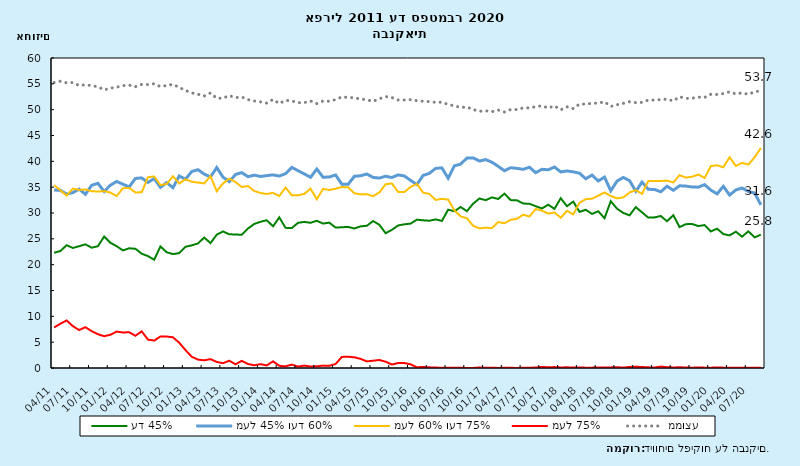
| Category | עד 45% | מעל 45% ועד 60% | מעל 60% ועד 75% | מעל 75%  | ממוצע |
|---|---|---|---|---|---|
| 2011-04-01 | 22.31 | 34.448 | 35.405 | 7.837 | 55.261 |
| 2011-05-01 | 22.647 | 34.385 | 34.396 | 8.572 | 55.509 |
| 2011-06-01 | 23.771 | 33.654 | 33.371 | 9.203 | 55.192 |
| 2011-07-01 | 23.235 | 33.946 | 34.726 | 8.092 | 55.252 |
| 2011-08-01 | 23.572 | 34.616 | 34.468 | 7.344 | 54.677 |
| 2011-09-01 | 23.937 | 33.622 | 34.542 | 7.899 | 54.814 |
| 2011-10-01 | 23.287 | 35.363 | 34.221 | 7.129 | 54.645 |
| 2011-11-01 | 23.569 | 35.745 | 34.145 | 6.541 | 54.432 |
| 2011-12-01 | 25.448 | 34.163 | 34.239 | 6.15 | 53.812 |
| 2012-01-01 | 24.229 | 35.382 | 33.955 | 6.435 | 54.163 |
| 2012-02-01 | 23.58 | 36.102 | 33.272 | 7.047 | 54.339 |
| 2012-03-01 | 22.758 | 35.565 | 34.799 | 6.878 | 54.667 |
| 2012-04-01 | 23.177 | 35.056 | 34.85 | 6.916 | 54.761 |
| 2012-05-01 | 23.079 | 36.692 | 33.984 | 6.245 | 54.438 |
| 2012-06-01 | 22.117 | 36.794 | 33.998 | 7.091 | 54.883 |
| 2012-07-01 | 21.663 | 35.916 | 36.922 | 5.499 | 54.85 |
| 2012-08-01 | 20.956 | 36.66 | 37.074 | 5.31 | 55.012 |
| 2012-09-01 | 23.53 | 34.964 | 35.402 | 6.105 | 54.457 |
| 2012-10-01 | 22.399 | 35.885 | 35.624 | 6.092 | 54.675 |
| 2012-11-01 | 22.052 | 34.889 | 37.116 | 5.943 | 54.901 |
| 2012-12-01 | 22.234 | 37.167 | 35.704 | 4.895 | 54.296 |
| 2013-01-01 | 23.457 | 36.54 | 36.534 | 3.47 | 53.73 |
| 2013-02-01 | 23.739 | 38.022 | 36.053 | 2.185 | 53.246 |
| 2013-03-01 | 24.106 | 38.382 | 35.888 | 1.624 | 52.987 |
| 2013-04-01 | 25.258 | 37.522 | 35.727 | 1.493 | 52.633 |
| 2013-05-01 | 24.172 | 36.972 | 37.14 | 1.715 | 53.237 |
| 2013-06-01 | 25.805 | 38.802 | 34.216 | 1.177 | 52.207 |
| 2013-07-01 | 26.432 | 36.933 | 35.711 | 0.924 | 52.22 |
| 2013-08-01 | 25.879 | 36.058 | 36.653 | 1.409 | 52.718 |
| 2013-09-01 | 25.844 | 37.451 | 35.986 | 0.719 | 52.334 |
| 2013-10-01 | 25.777 | 37.817 | 35.026 | 1.38 | 52.448 |
| 2013-11-01 | 26.999 | 37.022 | 35.212 | 0.767 | 51.943 |
| 2013-12-01 | 27.882 | 37.327 | 34.26 | 0.531 | 51.68 |
| 2014-01-01 | 28.304 | 37.07 | 33.882 | 0.744 | 51.508 |
| 2014-02-01 | 28.595 | 37.235 | 33.667 | 0.503 | 51.261 |
| 2014-03-01 | 27.42 | 37.383 | 33.911 | 1.286 | 51.976 |
| 2014-04-01 | 29.15 | 37.15 | 33.276 | 0.424 | 51.192 |
| 2014-05-01 | 27.127 | 37.617 | 34.938 | 0.317 | 51.805 |
| 2014-06-01 | 27.084 | 38.831 | 33.429 | 0.656 | 51.689 |
| 2014-07-01 | 28.104 | 38.19 | 33.434 | 0.272 | 51.349 |
| 2014-08-01 | 28.281 | 37.557 | 33.7 | 0.463 | 51.359 |
| 2014-09-01 | 28.102 | 36.91 | 34.698 | 0.291 | 51.679 |
| 2014-10-01 | 28.493 | 38.508 | 32.664 | 0.335 | 51.171 |
| 2014-11-01 | 27.956 | 36.921 | 34.662 | 0.461 | 51.684 |
| 2014-12-01 | 28.134 | 36.969 | 34.464 | 0.433 | 51.631 |
| 2015-01-01 | 27.175 | 37.359 | 34.691 | 0.774 | 51.944 |
| 2015-02-01 | 27.242 | 35.583 | 35.03 | 2.144 | 52.467 |
| 2015-03-01 | 27.305 | 35.539 | 34.973 | 2.183 | 52.367 |
| 2015-04-01 | 27.007 | 37.098 | 33.825 | 2.069 | 52.285 |
| 2015-05-01 | 27.413 | 37.208 | 33.608 | 1.77 | 52.074 |
| 2015-06-01 | 27.525 | 37.55 | 33.647 | 1.278 | 51.906 |
| 2015-07-01 | 28.443 | 36.887 | 33.258 | 1.413 | 51.619 |
| 2015-08-01 | 27.718 | 36.759 | 33.976 | 1.547 | 52.101 |
| 2015-09-01 | 26.093 | 37.12 | 35.564 | 1.224 | 52.54 |
| 2015-10-01 | 26.733 | 36.863 | 35.731 | 0.673 | 52.34 |
| 2015-11-01 | 27.588 | 37.375 | 34.078 | 0.959 | 51.87 |
| 2015-12-01 | 27.811 | 37.162 | 34.061 | 0.967 | 51.874 |
| 2016-01-01 | 27.947 | 36.305 | 35.038 | 0.709 | 51.941 |
| 2016-02-01 | 28.711 | 35.515 | 35.635 | 0.139 | 51.733 |
| 2016-03-01 | 28.584 | 37.276 | 33.939 | 0.202 | 51.629 |
| 2016-04-01 | 28.508 | 37.681 | 33.684 | 0.127 | 51.558 |
| 2016-05-01 | 28.762 | 38.631 | 32.529 | 0.078 | 51.422 |
| 2016-06-01 | 28.471 | 38.732 | 32.737 | 0.061 | 51.446 |
| 2016-07-01 | 30.636 | 36.731 | 32.594 | 0.039 | 51.008 |
| 2016-08-01 | 30.341 | 39.126 | 30.5 | 0.034 | 50.733 |
| 2016-09-01 | 31.155 | 39.463 | 29.333 | 0.049 | 50.426 |
| 2016-10-01 | 30.356 | 40.637 | 28.996 | 0.011 | 50.527 |
| 2016-11-01 | 31.808 | 40.666 | 27.512 | 0.013 | 50.009 |
| 2016-12-01 | 32.809 | 40.051 | 27.036 | 0.104 | 49.689 |
| 2017-01-01 | 32.48 | 40.335 | 27.149 | 0.036 | 49.774 |
| 2017-02-01 | 33.026 | 39.833 | 27.076 | 0.065 | 49.615 |
| 2017-03-01 | 32.715 | 39.027 | 28.253 | 0.006 | 49.931 |
| 2017-04-01 | 33.745 | 38.184 | 28.005 | 0.066 | 49.549 |
| 2017-05-01 | 32.495 | 38.771 | 28.695 | 0.039 | 50.032 |
| 2017-06-01 | 32.461 | 38.637 | 28.889 | 0.013 | 50.022 |
| 2017-07-01 | 31.839 | 38.448 | 29.666 | 0.046 | 50.344 |
| 2017-08-01 | 31.775 | 38.856 | 29.325 | 0.045 | 50.341 |
| 2017-09-01 | 31.318 | 37.81 | 30.776 | 0.096 | 50.569 |
| 2017-10-01 | 30.877 | 38.46 | 30.469 | 0.193 | 50.756 |
| 2017-11-01 | 31.605 | 38.363 | 29.884 | 0.148 | 50.309 |
| 2017-12-01 | 30.806 | 38.903 | 30.115 | 0.175 | 50.731 |
| 2018-01-01 | 32.862 | 37.954 | 29.076 | 0.107 | 49.97 |
| 2018-02-01 | 31.315 | 38.136 | 30.419 | 0.131 | 50.554 |
| 2018-03-01 | 32.205 | 37.962 | 29.74 | 0.092 | 50.204 |
| 2018-04-01 | 30.213 | 37.705 | 31.972 | 0.11 | 51.097 |
| 2018-05-01 | 30.625 | 36.631 | 32.679 | 0.065 | 51.058 |
| 2018-06-01 | 29.825 | 37.334 | 32.772 | 0.07 | 51.242 |
| 2018-07-01 | 30.342 | 36.196 | 33.365 | 0.096 | 51.252 |
| 2018-08-01 | 28.985 | 36.949 | 33.979 | 0.088 | 51.532 |
| 2018-09-01 | 32.29 | 34.296 | 33.296 | 0.118 | 50.624 |
| 2018-10-01 | 30.837 | 36.171 | 32.835 | 0.157 | 50.949 |
| 2018-11-01 | 30.021 | 36.881 | 33.024 | 0.074 | 51.215 |
| 2018-12-01 | 29.546 | 36.262 | 33.984 | 0.208 | 51.538 |
| 2019-01-01 | 31.14 | 34.208 | 34.408 | 0.245 | 51.354 |
| 2019-02-01 | 30.127 | 35.983 | 33.705 | 0.184 | 51.412 |
| 2019-03-01 | 29.104 | 34.588 | 36.182 | 0.126 | 51.856 |
| 2019-04-01 | 29.155 | 34.549 | 36.208 | 0.089 | 51.862 |
| 2019-05-01 | 29.416 | 34.111 | 36.193 | 0.28 | 51.951 |
| 2019-06-01 | 28.4 | 35.186 | 36.268 | 0.146 | 52.035 |
| 2019-07-01 | 29.583 | 34.394 | 35.911 | 0.112 | 51.689 |
| 2019-08-01 | 27.274 | 35.267 | 37.328 | 0.13 | 52.5 |
| 2019-09-01 | 27.839 | 35.206 | 36.847 | 0.107 | 52.17 |
| 2019-10-01 | 27.871 | 35.037 | 37.029 | 0.063 | 52.21 |
| 2019-11-01 | 27.472 | 35 | 37.433 | 0.095 | 52.428 |
| 2019-12-01 | 27.668 | 35.488 | 36.773 | 0.072 | 52.356 |
| 2020-01-01 | 26.428 | 34.428 | 39.081 | 0.063 | 52.98 |
| 2020-02-01 | 26.969 | 33.697 | 39.231 | 0.104 | 52.937 |
| 2020-03-01 | 25.92 | 35.163 | 38.85 | 0.067 | 53.115 |
| 2020-04-01 | 25.669 | 33.47 | 40.797 | 0.064 | 53.452 |
| 2020-05-01 | 26.373 | 34.463 | 39.1 | 0.064 | 53.044 |
| 2020-06-01 | 25.417 | 34.83 | 39.705 | 0.048 | 53.245 |
| 2020-07-01 | 26.455 | 34.156 | 39.366 | 0.022 | 52.973 |
| 2020-08-01 | 25.285 | 33.868 | 40.792 | 0.055 | 53.456 |
| 2020-09-01 | 25.813 | 31.579 | 42.573 | 0.035 | 53.663 |